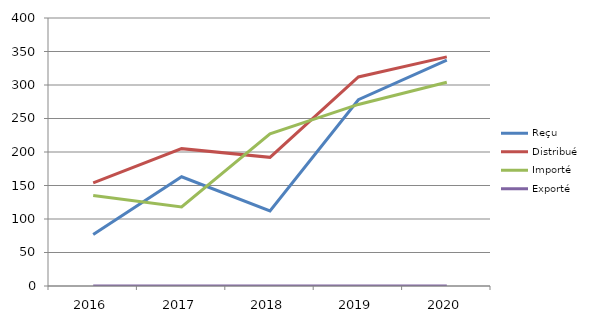
| Category | Reçu | Distribué | Importé | Exporté |
|---|---|---|---|---|
| 2016.0 | 77 | 154 | 135 | 0 |
| 2017.0 | 163 | 205 | 118 | 0 |
| 2018.0 | 112 | 192 | 227 | 0 |
| 2019.0 | 278 | 312 | 271 | 0 |
| 2020.0 | 337 | 342 | 304 | 0 |